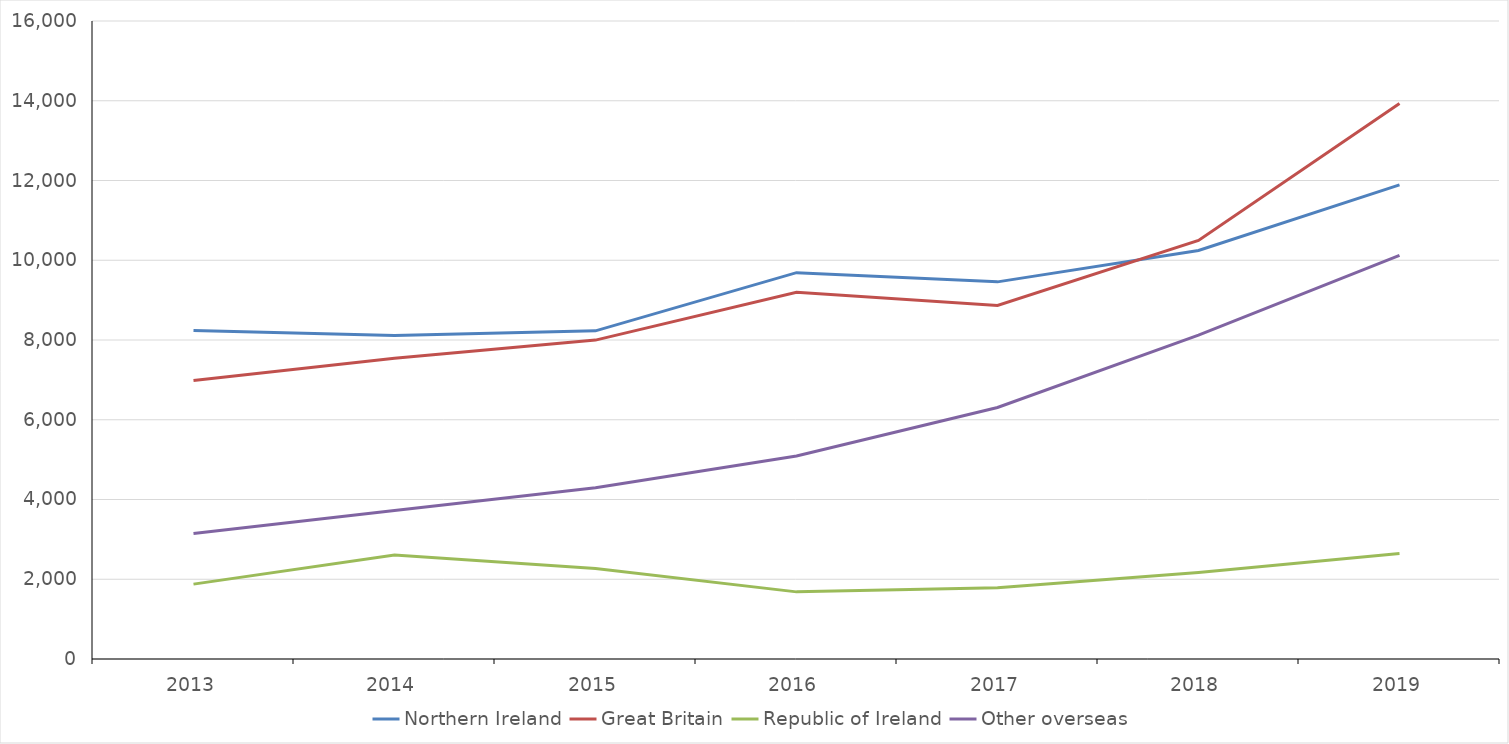
| Category | Northern Ireland | Great Britain | Republic of Ireland | Other overseas  |
|---|---|---|---|---|
| 2013.0 | 8238.994 | 6986.403 | 1877.399 | 3144.838 |
| 2014.0 | 8111.252 | 7544.945 | 2609.96 | 3723.025 |
| 2015.0 | 8229.447 | 7997.311 | 2268.114 | 4297.316 |
| 2016.0 | 9688.424 | 9199.316 | 1683.443 | 5091.187 |
| 2017.0 | 9457.999 | 8866.686 | 1789.394 | 6306.897 |
| 2018.0 | 10245.611 | 10495.636 | 2172.004 | 8124.394 |
| 2019.0 | 11889.84 | 13932.871 | 2643.627 | 10120.601 |